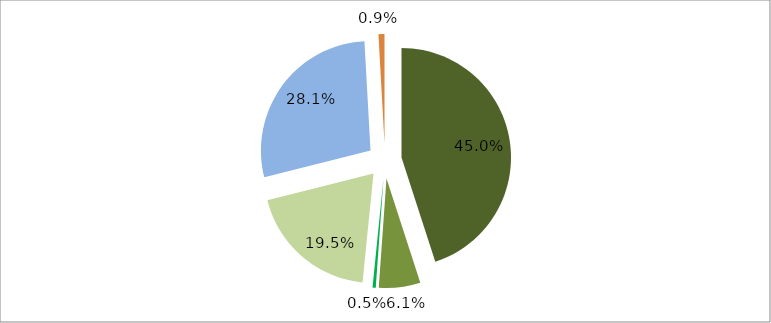
| Category | Series 0 |
|---|---|
| 0 | 0.45 |
| 1 | 0.061 |
| 2 | 0.005 |
| 3 | 0.195 |
| 4 | 0.281 |
| 5 | 0.009 |